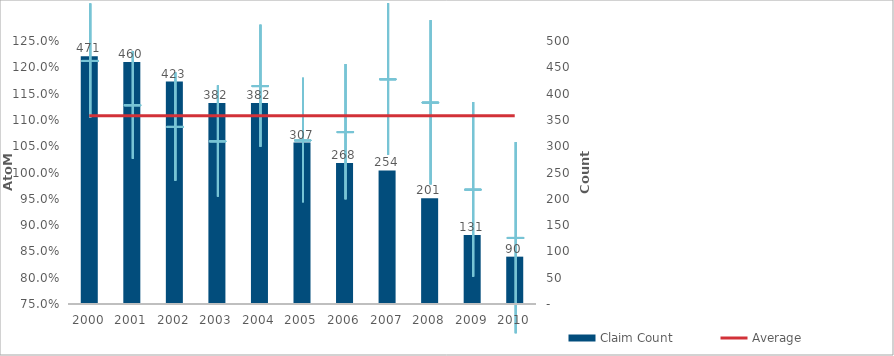
| Category | Claim Count |
|---|---|
| 0 | 471 |
| 1 | 460 |
| 2 | 423 |
| 3 | 382 |
| 4 | 382 |
| 5 | 307 |
| 6 | 268 |
| 7 | 254 |
| 8 | 201 |
| 9 | 131 |
| 10 | 90 |